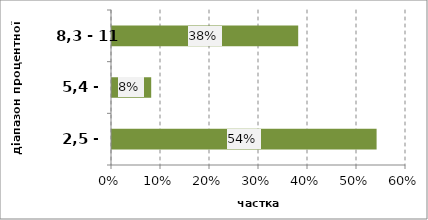
| Category | Series 0 |
|---|---|
| 2,5 - 5,3 | 0.54 |
| 5,4 - 8,2 | 0.08 |
| 8,3 - 11 | 0.38 |